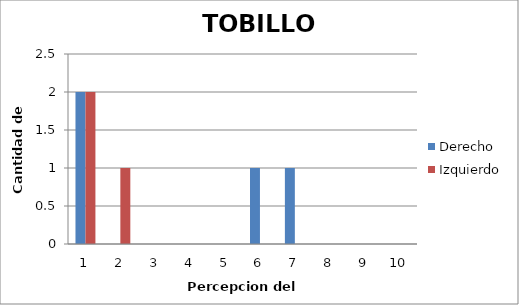
| Category | Derecho  | Izquierdo |
|---|---|---|
| 0 | 2 | 2 |
| 1 | 0 | 1 |
| 2 | 0 | 0 |
| 3 | 0 | 0 |
| 4 | 0 | 0 |
| 5 | 1 | 0 |
| 6 | 1 | 0 |
| 7 | 0 | 0 |
| 8 | 0 | 0 |
| 9 | 0 | 0 |